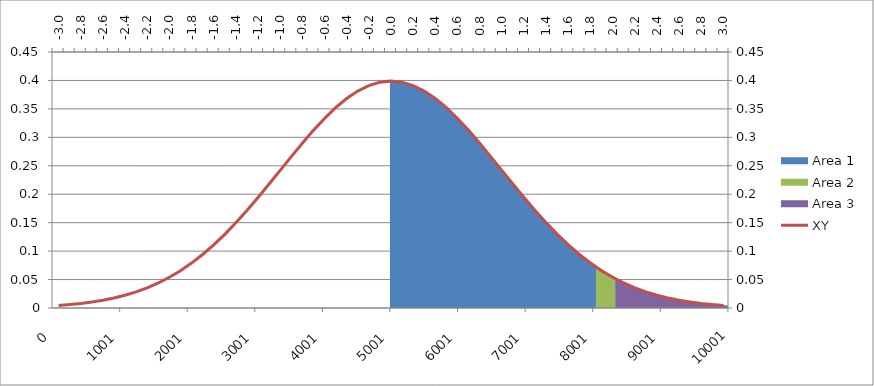
| Category | XY |
|---|---|
| -3.0 | 0.004 |
| -2.9 | 0.006 |
| -2.8 | 0.008 |
| -2.6999999999999997 | 0.01 |
| -2.5999999999999996 | 0.014 |
| -2.4999999999999996 | 0.018 |
| -2.3999999999999995 | 0.022 |
| -2.2999999999999994 | 0.028 |
| -2.1999999999999993 | 0.035 |
| -2.099999999999999 | 0.044 |
| -1.9999999999999991 | 0.054 |
| -1.899999999999999 | 0.066 |
| -1.799999999999999 | 0.079 |
| -1.6999999999999988 | 0.094 |
| -1.5999999999999988 | 0.111 |
| -1.4999999999999987 | 0.13 |
| -1.3999999999999986 | 0.15 |
| -1.2999999999999985 | 0.171 |
| -1.1999999999999984 | 0.194 |
| -1.0999999999999983 | 0.218 |
| -0.9999999999999983 | 0.242 |
| -0.8999999999999984 | 0.266 |
| -0.7999999999999984 | 0.29 |
| -0.6999999999999984 | 0.312 |
| -0.5999999999999984 | 0.333 |
| -0.49999999999999845 | 0.352 |
| -0.39999999999999847 | 0.368 |
| -0.2999999999999985 | 0.381 |
| -0.19999999999999848 | 0.391 |
| -0.09999999999999848 | 0.397 |
| 1.5265566588595902e-15 | 0.399 |
| 0.10000000000000153 | 0.397 |
| 0.20000000000000154 | 0.391 |
| 0.30000000000000154 | 0.381 |
| 0.4000000000000016 | 0.368 |
| 0.5000000000000016 | 0.352 |
| 0.6000000000000015 | 0.333 |
| 0.7000000000000015 | 0.312 |
| 0.8000000000000015 | 0.29 |
| 0.9000000000000015 | 0.266 |
| 1.0000000000000016 | 0.242 |
| 1.1000000000000016 | 0.218 |
| 1.2000000000000017 | 0.194 |
| 1.3000000000000018 | 0.171 |
| 1.400000000000002 | 0.15 |
| 1.500000000000002 | 0.13 |
| 1.600000000000002 | 0.111 |
| 1.7000000000000022 | 0.094 |
| 1.8000000000000023 | 0.079 |
| 1.9000000000000024 | 0.066 |
| 2.000000000000002 | 0.054 |
| 2.1000000000000023 | 0.044 |
| 2.2000000000000024 | 0.035 |
| 2.3000000000000025 | 0.028 |
| 2.4000000000000026 | 0.022 |
| 2.5000000000000027 | 0.018 |
| 2.6000000000000028 | 0.014 |
| 2.700000000000003 | 0.01 |
| 2.800000000000003 | 0.008 |
| 2.900000000000003 | 0.006 |
| 3.000000000000003 | 0.004 |